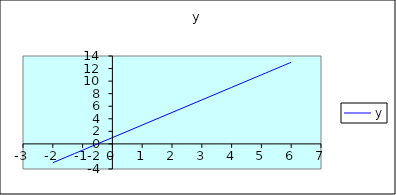
| Category | y |
|---|---|
| -2.0 | -3 |
| -1.0 | -1 |
| 0.0 | 1 |
| 1.0 | 3 |
| 2.0 | 5 |
| 3.0 | 7 |
| 4.0 | 9 |
| 5.0 | 11 |
| 6.0 | 13 |